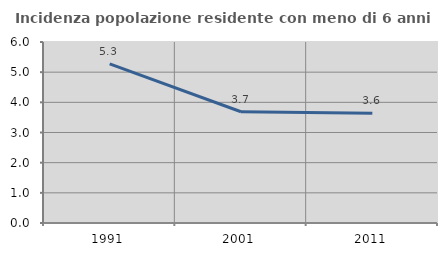
| Category | Incidenza popolazione residente con meno di 6 anni |
|---|---|
| 1991.0 | 5.277 |
| 2001.0 | 3.688 |
| 2011.0 | 3.639 |